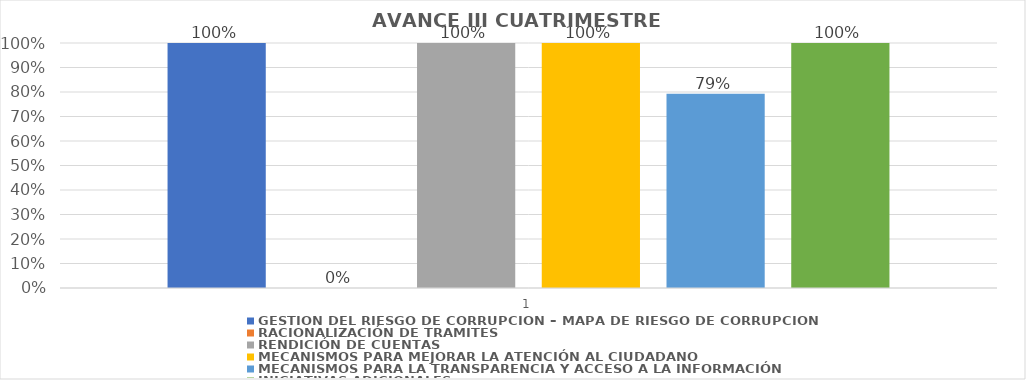
| Category | GESTIÓN DEL RIESGO DE CORRUPCIÓN – MAPA DE RIESGO DE CORRUPCIÓN  | RACIONALIZACIÓN DE TRAMITES | RENDICIÓN DE CUENTAS | MECANISMOS PARA MEJORAR LA ATENCIÓN AL CIUDADANO | MECANISMOS PARA LA TRANSPARENCIA Y ACCESO A LA INFORMACIÓN | INICIATIVAS ADICIONALES |
|---|---|---|---|---|---|---|
| 0 | 1 | 0 | 1 | 1 | 0.793 | 1 |